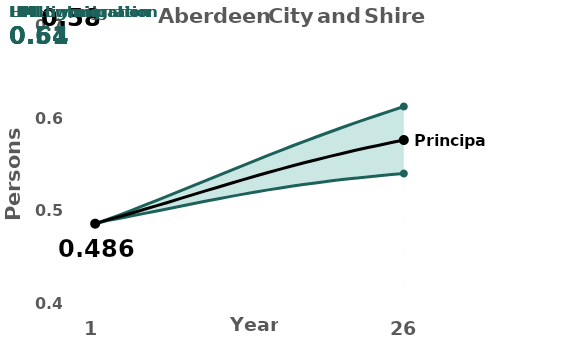
| Category | High migration | Low migration  | Principal |
|---|---|---|---|
| 0 | 0.486 | 0.486 | 0.486 |
| 1 | 0.491 | 0.489 | 0.49 |
| 2 | 0.496 | 0.492 | 0.494 |
| 3 | 0.501 | 0.494 | 0.498 |
| 4 | 0.506 | 0.497 | 0.501 |
| 5 | 0.511 | 0.5 | 0.505 |
| 6 | 0.517 | 0.502 | 0.509 |
| 7 | 0.522 | 0.505 | 0.514 |
| 8 | 0.527 | 0.508 | 0.518 |
| 9 | 0.533 | 0.51 | 0.522 |
| 10 | 0.538 | 0.513 | 0.526 |
| 11 | 0.544 | 0.515 | 0.53 |
| 12 | 0.549 | 0.518 | 0.534 |
| 13 | 0.555 | 0.52 | 0.538 |
| 14 | 0.56 | 0.523 | 0.541 |
| 15 | 0.565 | 0.525 | 0.545 |
| 16 | 0.57 | 0.527 | 0.549 |
| 17 | 0.575 | 0.529 | 0.552 |
| 18 | 0.58 | 0.53 | 0.555 |
| 19 | 0.585 | 0.532 | 0.559 |
| 20 | 0.59 | 0.534 | 0.562 |
| 21 | 0.595 | 0.535 | 0.565 |
| 22 | 0.599 | 0.537 | 0.568 |
| 23 | 0.604 | 0.538 | 0.571 |
| 24 | 0.608 | 0.539 | 0.574 |
| 25 | 0.613 | 0.54 | 0.577 |